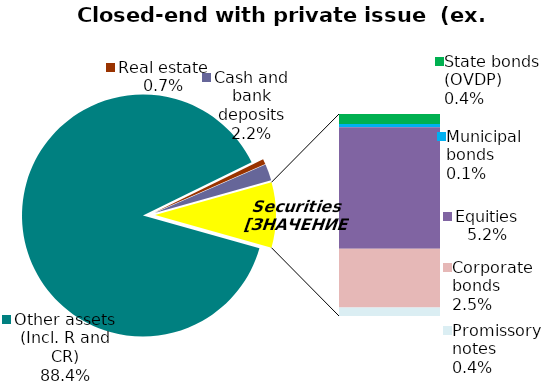
| Category | Series 0 |
|---|---|
| Other assets (Incl. R and CR) | 0.884 |
| Real estate | 0.007 |
| Cash and bank deposits | 0.022 |
| Bank metals | 0 |
| State bonds (OVDP) | 0.004 |
| Municipal bonds | 0.001 |
| Equities | 0.052 |
| Corporate bonds | 0.025 |
| Promissory notes | 0.004 |